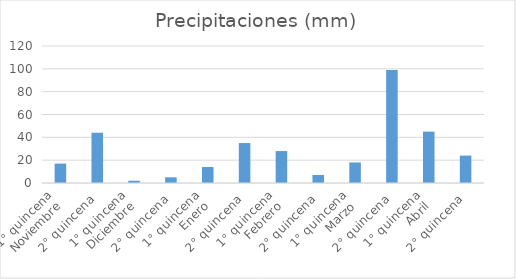
| Category | Series 0 |
|---|---|
| 0 | 17 |
| 1 | 44 |
| 2 | 2 |
| 3 | 5 |
| 4 | 14 |
| 5 | 35 |
| 6 | 28 |
| 7 | 7 |
| 8 | 18 |
| 9 | 99 |
| 10 | 45 |
| 11 | 24 |